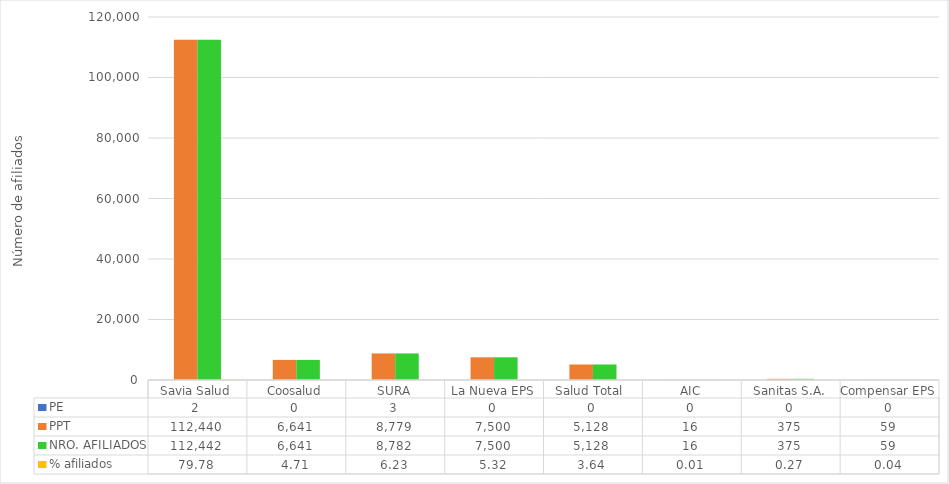
| Category | PE | PPT | NRO. AFILIADOS | % afiliados |
|---|---|---|---|---|
| Savia Salud | 2 | 112440 | 112442 | 79.778 |
| Coosalud | 0 | 6641 | 6641 | 4.712 |
| SURA | 3 | 8779 | 8782 | 6.231 |
| La Nueva EPS | 0 | 7500 | 7500 | 5.321 |
| Salud Total  | 0 | 5128 | 5128 | 3.638 |
| AIC | 0 | 16 | 16 | 0.011 |
| Sanitas S.A. | 0 | 375 | 375 | 0.266 |
| Compensar EPS | 0 | 59 | 59 | 0.042 |